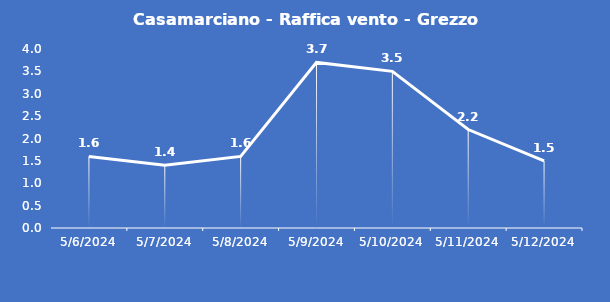
| Category | Casamarciano - Raffica vento - Grezzo (m/s) |
|---|---|
| 5/6/24 | 1.6 |
| 5/7/24 | 1.4 |
| 5/8/24 | 1.6 |
| 5/9/24 | 3.7 |
| 5/10/24 | 3.5 |
| 5/11/24 | 2.2 |
| 5/12/24 | 1.5 |